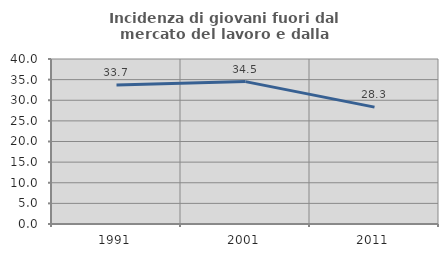
| Category | Incidenza di giovani fuori dal mercato del lavoro e dalla formazione  |
|---|---|
| 1991.0 | 33.702 |
| 2001.0 | 34.519 |
| 2011.0 | 28.336 |